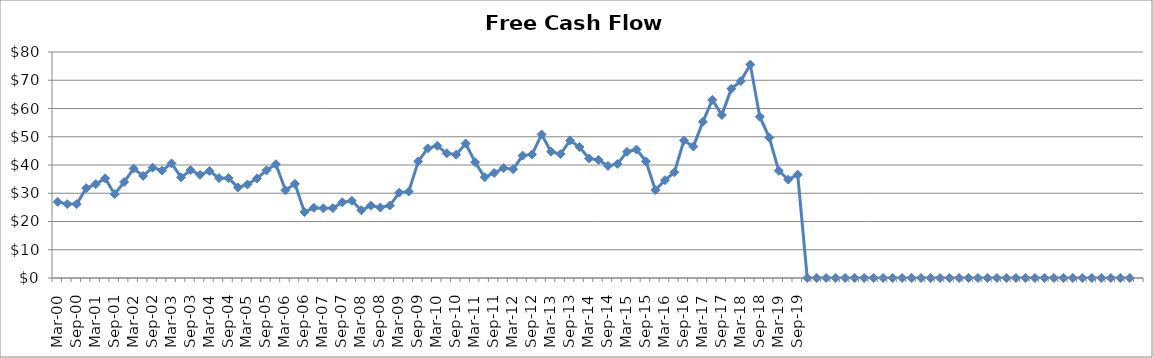
| Category | Series 0 |
|---|---|
| Mar-00 | 26.938 |
| Jun-00 | 26.164 |
| Sep-00 | 26.16 |
| Dec-00 | 31.803 |
| Mar-01 | 33.214 |
| Jun-01 | 35.25 |
| Sep-01 | 29.679 |
| Dec-01 | 33.987 |
| Mar-02 | 38.742 |
| Jun-02 | 36.141 |
| Sep-02 | 39.064 |
| Dec-02 | 38.006 |
| Mar-03 | 40.572 |
| Jun-03 | 35.608 |
| Sep-03 | 38.164 |
| Dec-03 | 36.514 |
| Mar-04 | 37.898 |
| Jun-04 | 35.336 |
| Sep-04 | 35.36 |
| Dec-04 | 32.059 |
| Mar-05 | 33.102 |
| Jun-05 | 35.238 |
| Sep-05 | 38.103 |
| Dec-05 | 40.272 |
| Mar-06 | 31.045 |
| Jun-06 | 33.326 |
| Sep-06 | 23.345 |
| Dec-06 | 24.851 |
| Mar-07 | 24.654 |
| Jun-07 | 24.736 |
| Sep-07 | 26.78 |
| Dec-07 | 27.326 |
| Mar-08 | 23.966 |
| Jun-08 | 25.648 |
| Sep-08 | 24.94 |
| Dec-08 | 25.657 |
| Mar-09 | 30.24 |
| Jun-09 | 30.598 |
| Sep-09 | 41.269 |
| Dec-09 | 45.866 |
| Mar-10 | 46.798 |
| Jun-10 | 44.128 |
| Sep-10 | 43.65 |
| Dec-10 | 47.588 |
| Mar-11 | 40.981 |
| Jun-11 | 35.661 |
| Sep-11 | 37.182 |
| Dec-11 | 38.911 |
| Mar-12 | 38.523 |
| Jun-12 | 43.322 |
| Sep-12 | 43.724 |
| Dec-12 | 50.807 |
| Mar-13 | 44.722 |
| Jun-13 | 43.848 |
| Sep-13 | 48.708 |
| Dec-13 | 46.372 |
| Mar-14 | 42.309 |
| Jun-14 | 41.808 |
| Sep-14 | 39.671 |
| Dec-14 | 40.385 |
| Mar-15 | 44.65 |
| Jun-15 | 45.467 |
| Sep-15 | 41.292 |
| Dec-15 | 31.104 |
| Mar-16 | 34.618 |
| Jun-16 | 37.404 |
| Sep-16 | 48.662 |
| Dec-16 | 46.542 |
| Mar-17 | 55.273 |
| Jun-17 | 63.066 |
| Sep-17 | 57.69 |
| Dec-17 | 66.987 |
| Mar-18 | 69.698 |
| Jun-18 | 75.546 |
| Sep-18 | 57.084 |
| Dec-18 | 49.708 |
| Mar-19 | 37.964 |
| Jun-19 | 34.847 |
| Sep-19 | 36.562 |